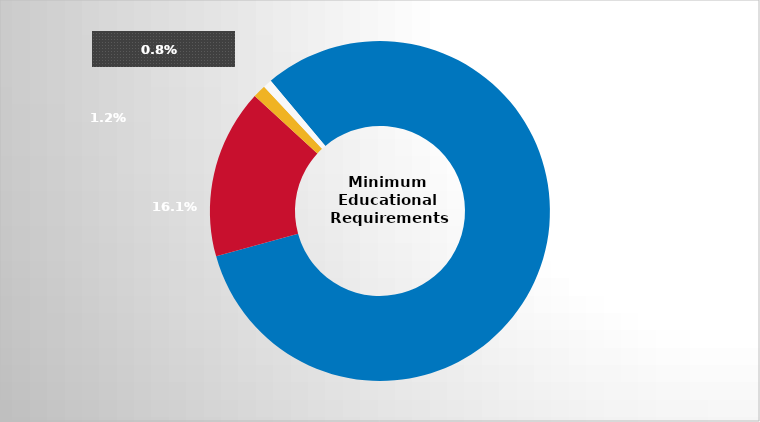
| Category | Series 0 |
|---|---|
| GED/High school diploma | 0.818 |
| Less than 1 year of college | 0.161 |
| 1 year of college | 0.012 |
| Other | 0.008 |